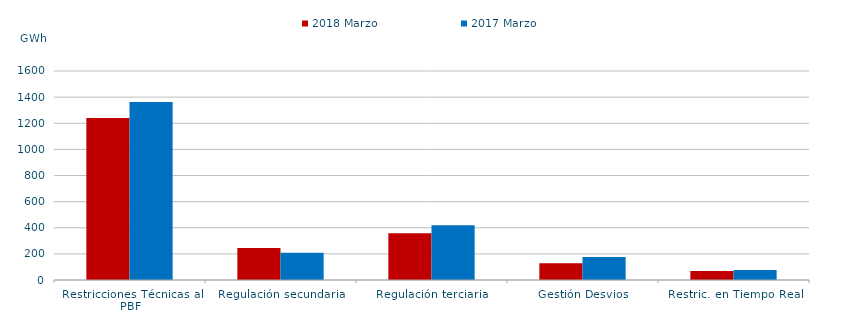
| Category | 2018 | 2017 |
|---|---|---|
| Restricciones Técnicas al PBF | 1240.766 | 1362.429 |
| Regulación secundaria | 245.343 | 207.956 |
| Regulación terciaria | 358.693 | 419.807 |
| Gestión Desvios | 128.821 | 175.148 |
| Restric. en Tiempo Real | 68.572 | 76.414 |